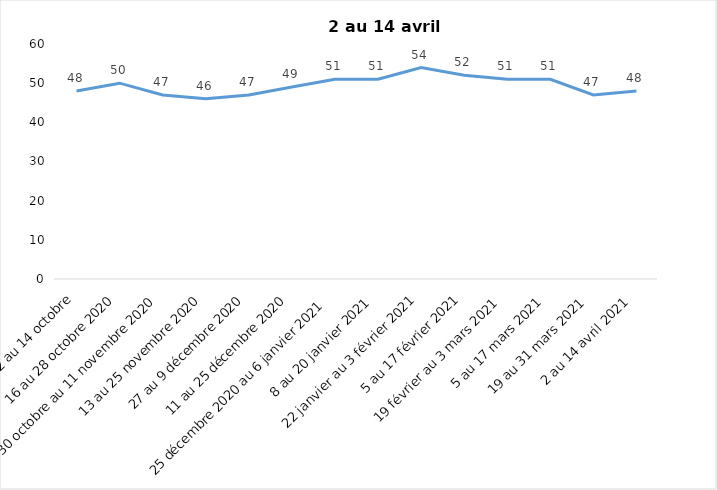
| Category | Toujours aux trois mesures |
|---|---|
| 2 au 14 octobre | 48 |
| 16 au 28 octobre 2020 | 50 |
| 30 octobre au 11 novembre 2020 | 47 |
| 13 au 25 novembre 2020 | 46 |
| 27 au 9 décembre 2020 | 47 |
| 11 au 25 décembre 2020 | 49 |
| 25 décembre 2020 au 6 janvier 2021 | 51 |
| 8 au 20 janvier 2021 | 51 |
| 22 janvier au 3 février 2021 | 54 |
| 5 au 17 février 2021 | 52 |
| 19 février au 3 mars 2021 | 51 |
| 5 au 17 mars 2021 | 51 |
| 19 au 31 mars 2021 | 47 |
| 2 au 14 avril 2021 | 48 |